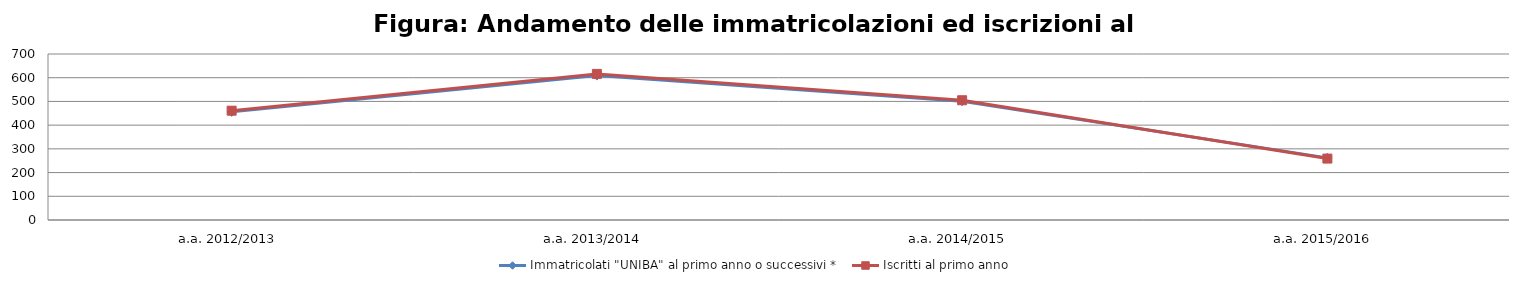
| Category | Immatricolati "UNIBA" al primo anno o successivi * | Iscritti al primo anno  |
|---|---|---|
| a.a. 2012/2013 | 456 | 461 |
| a.a. 2013/2014 | 609 | 616 |
| a.a. 2014/2015 | 501 | 505 |
| a.a. 2015/2016 | 262 | 259 |